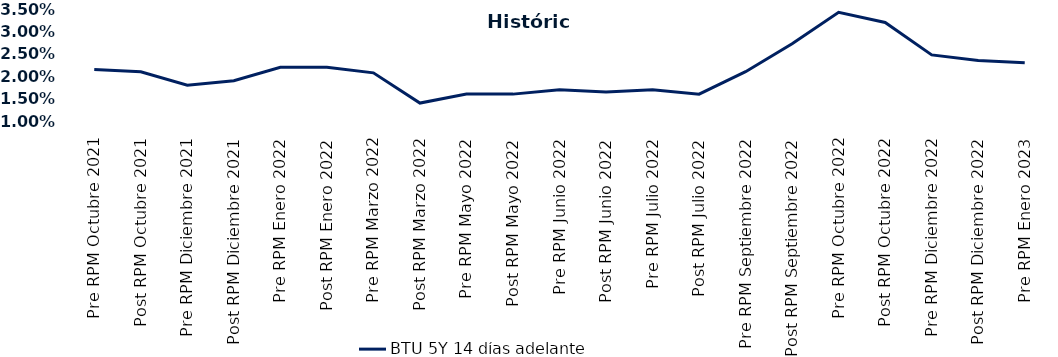
| Category | BTU 5Y 14 días adelante |
|---|---|
| Pre RPM Octubre 2021 | 0.022 |
| Post RPM Octubre 2021 | 0.021 |
| Pre RPM Diciembre 2021 | 0.018 |
| Post RPM Diciembre 2021 | 0.019 |
| Pre RPM Enero 2022 | 0.022 |
| Post RPM Enero 2022 | 0.022 |
| Pre RPM Marzo 2022 | 0.021 |
| Post RPM Marzo 2022 | 0.014 |
| Pre RPM Mayo 2022 | 0.016 |
| Post RPM Mayo 2022 | 0.016 |
| Pre RPM Junio 2022 | 0.017 |
| Post RPM Junio 2022 | 0.016 |
| Pre RPM Julio 2022 | 0.017 |
| Post RPM Julio 2022 | 0.016 |
| Pre RPM Septiembre 2022 | 0.021 |
| Post RPM Septiembre 2022 | 0.027 |
| Pre RPM Octubre 2022 | 0.034 |
| Post RPM Octubre 2022 | 0.032 |
| Pre RPM Diciembre 2022 | 0.025 |
| Post RPM Diciembre 2022 | 0.024 |
| Pre RPM Enero 2023 | 0.023 |